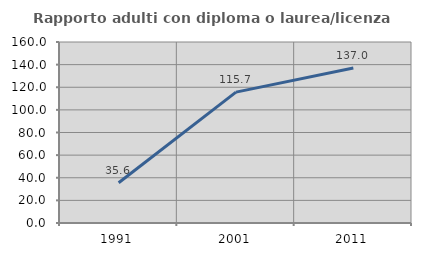
| Category | Rapporto adulti con diploma o laurea/licenza media  |
|---|---|
| 1991.0 | 35.567 |
| 2001.0 | 115.666 |
| 2011.0 | 136.977 |